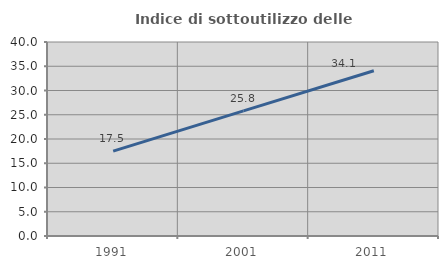
| Category | Indice di sottoutilizzo delle abitazioni  |
|---|---|
| 1991.0 | 17.489 |
| 2001.0 | 25.795 |
| 2011.0 | 34.076 |